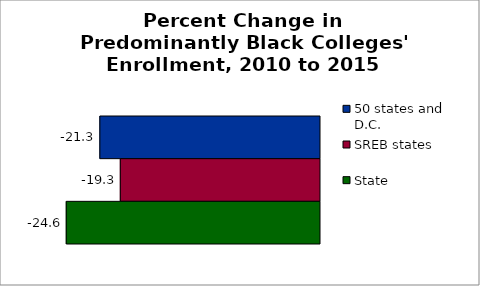
| Category | 50 states and D.C. | SREB states | State |
|---|---|---|---|
| 2010 to 2015 | -21.326 | -19.339 | -24.587 |